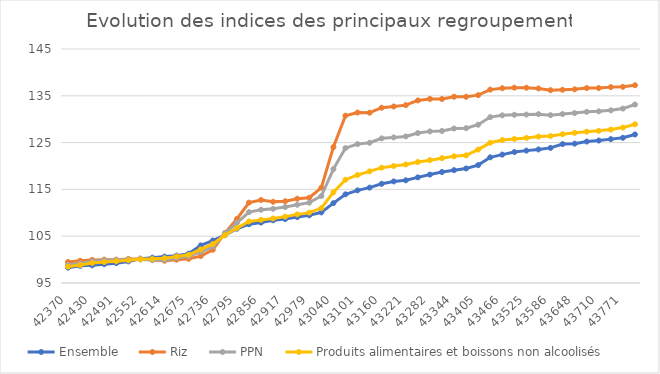
| Category | Ensemble | Riz | PPN | Produits alimentaires et boissons non alcoolisés |
|---|---|---|---|---|
| 42370.0 | 98.275 | 99.495 | 98.861 | 98.497 |
| 42401.0 | 98.669 | 99.754 | 99.183 | 98.836 |
| 42430.0 | 98.78 | 99.934 | 99.647 | 99.278 |
| 42461.0 | 99.017 | 99.994 | 99.867 | 99.476 |
| 42491.0 | 99.242 | 99.991 | 99.897 | 99.634 |
| 42522.0 | 99.614 | 100.144 | 100.021 | 99.851 |
| 42552.0 | 100.2 | 100.14 | 100.04 | 100.066 |
| 42583.0 | 100.412 | 99.904 | 99.904 | 100.159 |
| 42614.0 | 100.639 | 99.746 | 99.918 | 100.312 |
| 42644.0 | 100.848 | 99.979 | 100.318 | 100.675 |
| 42675.0 | 101.278 | 100.17 | 100.701 | 101.025 |
| 42705.0 | 103.026 | 100.747 | 101.643 | 102.191 |
| 42736.0 | 104.075 | 102.088 | 102.766 | 103.319 |
| 42767.0 | 105.227 | 105.671 | 105.604 | 105.201 |
| 42795.0 | 106.597 | 108.676 | 107.857 | 106.739 |
| 42826.0 | 107.562 | 112.176 | 110.14 | 108.143 |
| 42856.0 | 107.914 | 112.738 | 110.659 | 108.491 |
| 42887.0 | 108.397 | 112.351 | 110.843 | 108.798 |
| 42917.0 | 108.659 | 112.464 | 111.234 | 109.178 |
| 42948.0 | 109.085 | 113.002 | 111.719 | 109.659 |
| 42979.0 | 109.466 | 113.231 | 112.163 | 110.039 |
| 43009.0 | 110.085 | 115.374 | 113.583 | 111.008 |
| 43040.0 | 112.067 | 124.042 | 119.334 | 114.381 |
| 43070.0 | 113.945 | 130.752 | 123.824 | 117.072 |
| 43101.0 | 114.792 | 131.429 | 124.677 | 118.083 |
| 43132.0 | 115.382 | 131.39 | 124.962 | 118.86 |
| 43160.0 | 116.197 | 132.45 | 125.908 | 119.648 |
| 43191.0 | 116.708 | 132.716 | 126.112 | 119.992 |
| 43221.0 | 116.945 | 133.005 | 126.317 | 120.318 |
| 43252.0 | 117.574 | 134.006 | 127.039 | 120.852 |
| 43282.0 | 118.169 | 134.333 | 127.399 | 121.251 |
| 43313.0 | 118.716 | 134.315 | 127.482 | 121.67 |
| 43344.0 | 119.112 | 134.797 | 128.002 | 122.064 |
| 43374.0 | 119.471 | 134.79 | 128.09 | 122.277 |
| 43405.0 | 120.196 | 135.136 | 128.817 | 123.5 |
| 43435.0 | 121.856 | 136.326 | 130.448 | 124.972 |
| 43466.0 | 122.431 | 136.617 | 130.824 | 125.539 |
| 43497.0 | 122.976 | 136.743 | 130.947 | 125.775 |
| 43525.0 | 123.287 | 136.724 | 130.988 | 126.003 |
| 43556.0 | 123.539 | 136.57 | 131.08 | 126.288 |
| 43586.0 | 123.87 | 136.199 | 130.864 | 126.405 |
| 43617.0 | 124.678 | 136.285 | 131.1 | 126.791 |
| 43648.0 | 124.773 | 136.384 | 131.306 | 127.081 |
| 43679.0 | 125.224 | 136.653 | 131.568 | 127.335 |
| 43710.0 | 125.442 | 136.653 | 131.684 | 127.515 |
| 43740.0 | 125.743 | 136.854 | 131.892 | 127.783 |
| 43771.0 | 126.03 | 136.915 | 132.269 | 128.209 |
| 43801.0 | 126.732 | 137.262 | 133.132 | 128.908 |